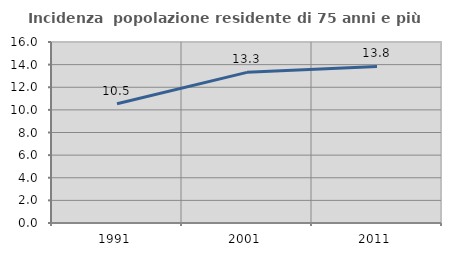
| Category | Incidenza  popolazione residente di 75 anni e più |
|---|---|
| 1991.0 | 10.537 |
| 2001.0 | 13.317 |
| 2011.0 | 13.835 |